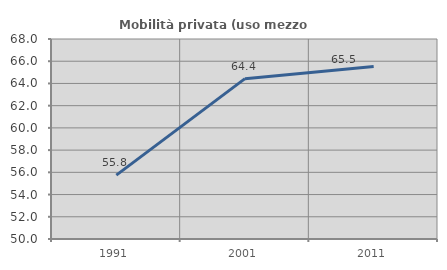
| Category | Mobilità privata (uso mezzo privato) |
|---|---|
| 1991.0 | 55.752 |
| 2001.0 | 64.431 |
| 2011.0 | 65.517 |